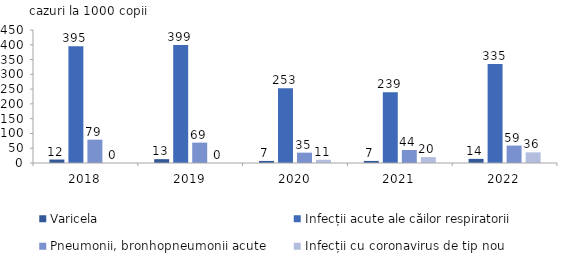
| Category | Varicela | Infecții acute ale căilor respiratorii  | Pneumonii, bronhopneumonii acute | Infecții cu coronavirus de tip nou |
|---|---|---|---|---|
| 2018.0 | 11.729 | 395 | 79 | 0 |
| 2019.0 | 13 | 399 | 69 | 0 |
| 2020.0 | 7 | 253 | 35 | 11 |
| 2021.0 | 7 | 239 | 44 | 20 |
| 2022.0 | 14 | 335 | 59 | 36 |